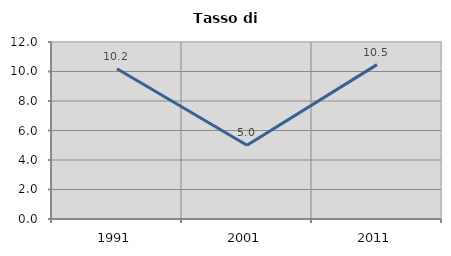
| Category | Tasso di disoccupazione   |
|---|---|
| 1991.0 | 10.185 |
| 2001.0 | 5 |
| 2011.0 | 10.465 |